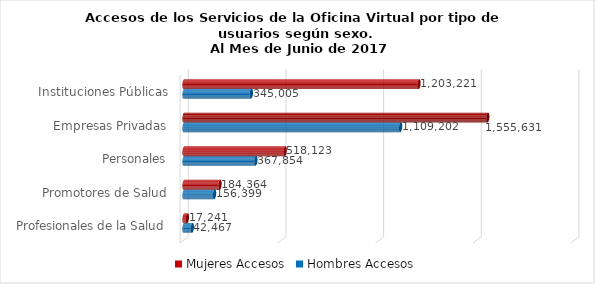
| Category | Mujeres | Hombres |
|---|---|---|
| Instituciones Públicas | 1203221 | 345005 |
| Empresas Privadas | 1555631 | 1109202 |
| Personales | 518123 | 367854 |
| Promotores de Salud | 184364 | 156399 |
| Profesionales de la Salud | 17241 | 42467 |